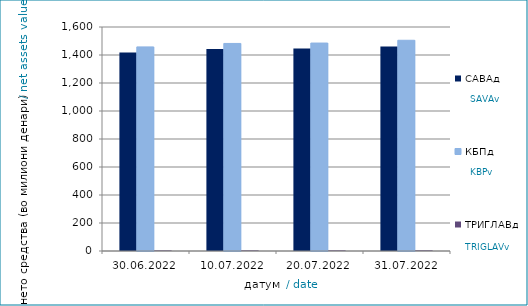
| Category | САВАд | КБПд | ТРИГЛАВд |
|---|---|---|---|
| 2022-06-30 | 1418.406 | 1457.912 | 4.533 |
| 2022-07-10 | 1443.256 | 1482.526 | 4.69 |
| 2022-07-20 | 1446.341 | 1485.37 | 4.793 |
| 2022-07-31 | 1460.928 | 1505.187 | 5.143 |